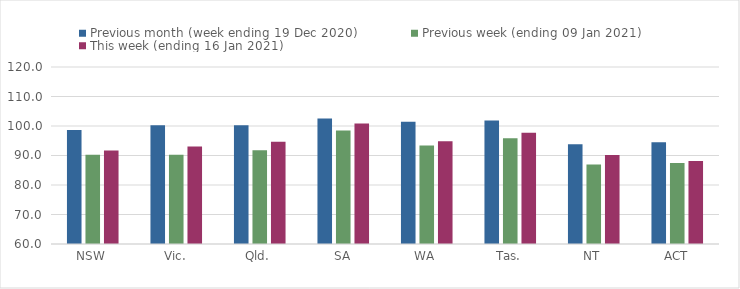
| Category | Previous month (week ending 19 Dec 2020) | Previous week (ending 09 Jan 2021) | This week (ending 16 Jan 2021) |
|---|---|---|---|
| NSW | 98.61 | 90.24 | 91.7 |
| Vic. | 100.26 | 90.25 | 93.04 |
| Qld. | 100.29 | 91.79 | 94.69 |
| SA | 102.51 | 98.46 | 100.84 |
| WA | 101.44 | 93.35 | 94.87 |
| Tas. | 101.89 | 95.88 | 97.74 |
| NT | 93.85 | 86.96 | 90.14 |
| ACT | 94.53 | 87.49 | 88.15 |